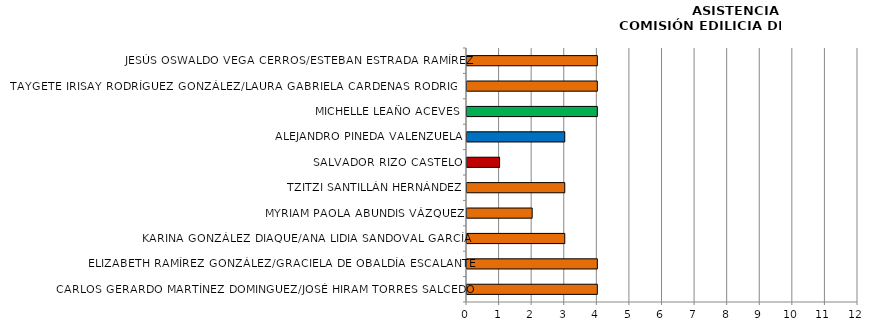
| Category | Series 0 |
|---|---|
| CARLOS GERARDO MARTÍNEZ DOMINGUEZ/JOSÉ HIRAM TORRES SALCEDO | 4 |
| ELIZABETH RAMÍREZ GONZÁLEZ/GRACIELA DE OBALDÍA ESCALANTE | 4 |
| KARINA GONZÁLEZ DIAQUE/ANA LIDIA SANDOVAL GARCÍA | 3 |
| MYRIAM PAOLA ABUNDIS VÁZQUEZ | 2 |
| TZITZI SANTILLÁN HERNÁNDEZ | 3 |
| SALVADOR RIZO CASTELO | 1 |
| ALEJANDRO PINEDA VALENZUELA | 3 |
| MICHELLE LEAÑO ACEVES | 4 |
| TAYGETE IRISAY RODRÍGUEZ GONZÁLEZ/LAURA GABRIELA CARDENAS RODRIGUEZ | 4 |
| JESÚS OSWALDO VEGA CERROS/ESTEBAN ESTRADA RAMÍREZ | 4 |